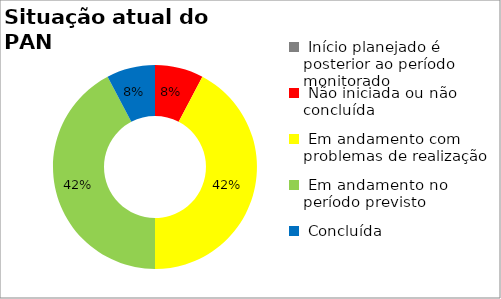
| Category | Series 0 |
|---|---|
|  Início planejado é posterior ao período monitorado | 0 |
|  Não iniciada ou não concluída | 0.077 |
|  Em andamento com problemas de realização | 0.423 |
|  Em andamento no período previsto  | 0.423 |
|  Concluída | 0.077 |